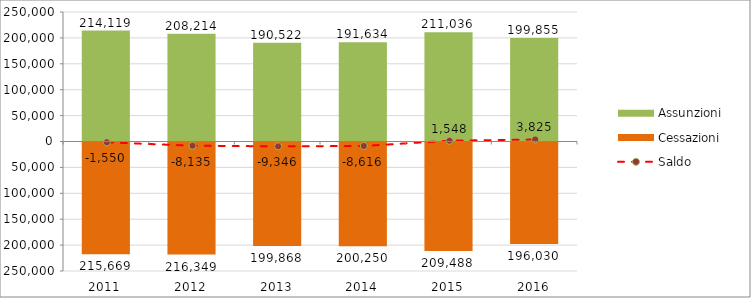
| Category | Assunzioni | Cessazioni |
|---|---|---|
| 2011.0 | 214119 | -215669 |
| 2012.0 | 208214 | -216349 |
| 2013.0 | 190522 | -199868 |
| 2014.0 | 191634 | -200250 |
| 2015.0 | 211036 | -209488 |
| 2016.0 | 199855 | -196030 |